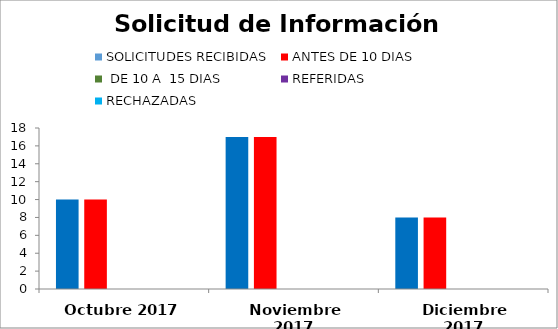
| Category | SOLICITUDES RECIBIDAS | ANTES DE 10 DIAS |  DE 10 A  15 DIAS  | REFERIDAS | RECHAZADAS |
|---|---|---|---|---|---|
| Octubre 2017 | 10 | 10 | 0 | 0 | 0 |
| Noviembre 2017 | 17 | 17 | 0 | 0 | 0 |
| Diciembre 2017 | 8 | 8 | 0 | 0 | 0 |